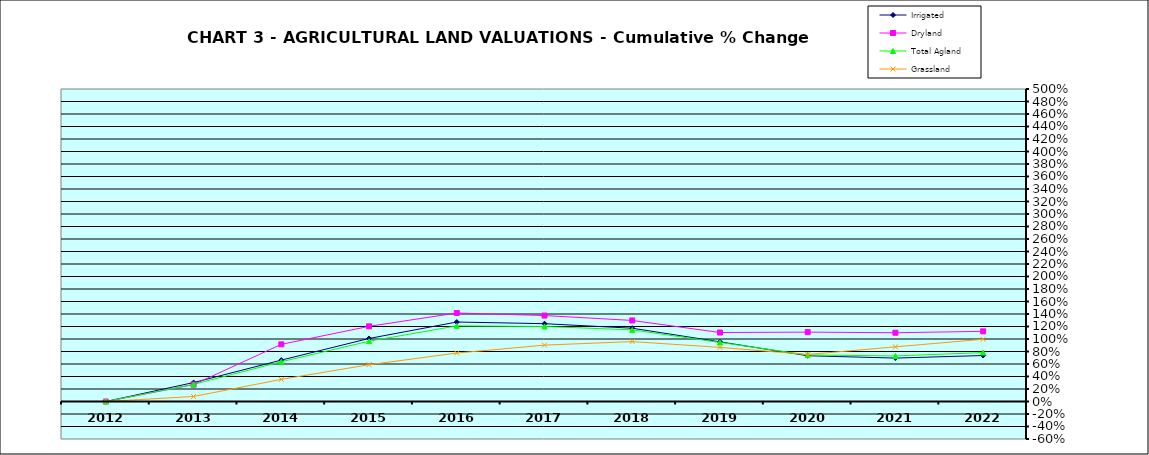
| Category | Irrigated | Dryland | Total Agland | Grassland |
|---|---|---|---|---|
| 2012.0 | 0 | 0 | 0 | 0 |
| 2013.0 | 0.303 | 0.27 | 0.274 | 0.08 |
| 2014.0 | 0.662 | 0.914 | 0.637 | 0.354 |
| 2015.0 | 1.008 | 1.203 | 0.965 | 0.588 |
| 2016.0 | 1.272 | 1.416 | 1.21 | 0.775 |
| 2017.0 | 1.245 | 1.375 | 1.2 | 0.902 |
| 2018.0 | 1.173 | 1.297 | 1.146 | 0.959 |
| 2019.0 | 0.954 | 1.104 | 0.945 | 0.866 |
| 2020.0 | 0.732 | 1.11 | 0.745 | 0.752 |
| 2021.0 | 0.695 | 1.1 | 0.729 | 0.875 |
| 2022.0 | 0.736 | 1.123 | 0.782 | 0.996 |